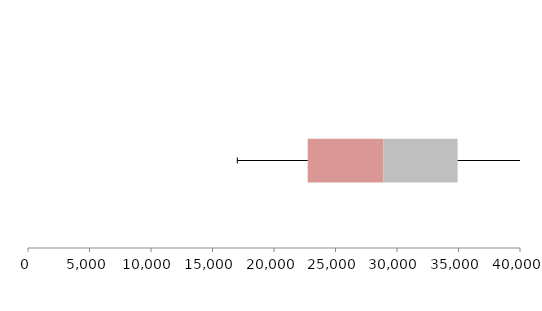
| Category | Series 1 | Series 2 | Series 3 |
|---|---|---|---|
| 0 | 22741.072 | 6159.813 | 6028.413 |